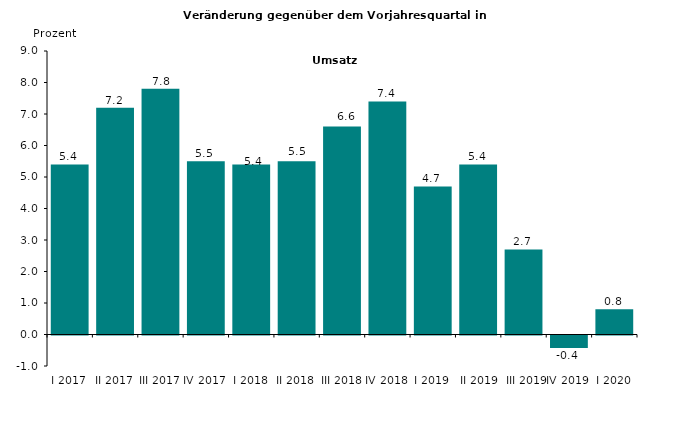
| Category | Series 0 |
|---|---|
| I 2017 | 5.4 |
| II 2017 | 7.2 |
| III 2017 | 7.8 |
| IV 2017 | 5.5 |
| I 2018 | 5.4 |
| II 2018 | 5.5 |
| III 2018 | 6.6 |
| IV 2018 | 7.4 |
| I 2019 | 4.7 |
|  II 2019 | 5.4 |
|  III 2019 | 2.7 |
| IV 2019 | -0.4 |
| I 2020 | 0.8 |